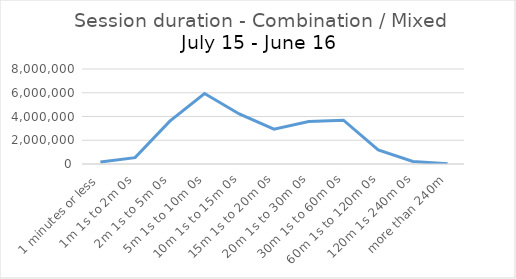
| Category | Combination / Mixed |
|---|---|
| 1 minutes or less | 164500 |
| 1m 1s to 2m 0s | 534417 |
| 2m 1s to 5m 0s | 3610179 |
| 5m 1s to 10m 0s | 5932996 |
| 10m 1s to 15m 0s | 4213875 |
| 15m 1s to 20m 0s | 2932100 |
| 20m 1s to 30m 0s | 3569710 |
| 30m 1s to 60m 0s | 3687582 |
| 60m 1s to 120m 0s | 1195396 |
| 120m 1s 240m 0s | 208732 |
| more than 240m | 19113 |